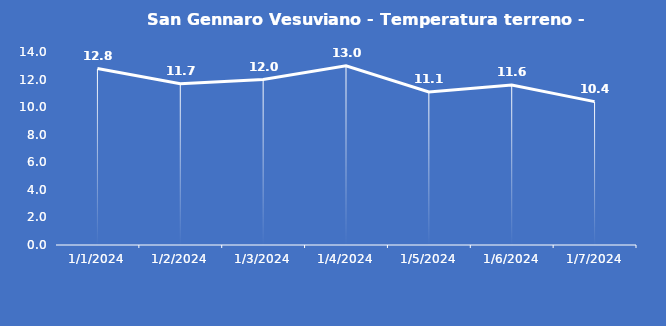
| Category | San Gennaro Vesuviano - Temperatura terreno - Grezzo (°C) |
|---|---|
| 1/1/24 | 12.8 |
| 1/2/24 | 11.7 |
| 1/3/24 | 12 |
| 1/4/24 | 13 |
| 1/5/24 | 11.1 |
| 1/6/24 | 11.6 |
| 1/7/24 | 10.4 |